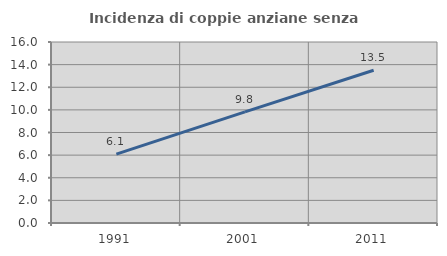
| Category | Incidenza di coppie anziane senza figli  |
|---|---|
| 1991.0 | 6.089 |
| 2001.0 | 9.827 |
| 2011.0 | 13.5 |